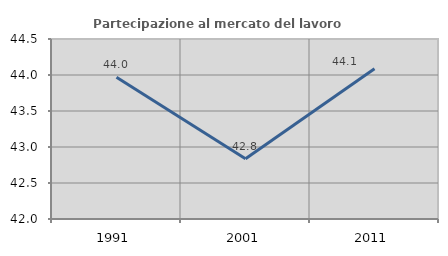
| Category | Partecipazione al mercato del lavoro  femminile |
|---|---|
| 1991.0 | 43.97 |
| 2001.0 | 42.836 |
| 2011.0 | 44.087 |